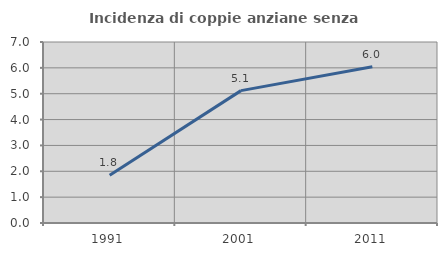
| Category | Incidenza di coppie anziane senza figli  |
|---|---|
| 1991.0 | 1.845 |
| 2001.0 | 5.119 |
| 2011.0 | 6.04 |